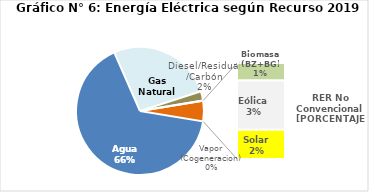
| Category | Series 0 |
|---|---|
| Agua | 3262.456 |
| Gas Natural | 1318.82 |
| Diesel/Residual/Carbón | 118.237 |
| Vapor (Cogeneracion) | 0.35 |
| Biomasa (BZ+BG) | 46.951 |
| Eólica | 131.848 |
| Solar | 78.589 |